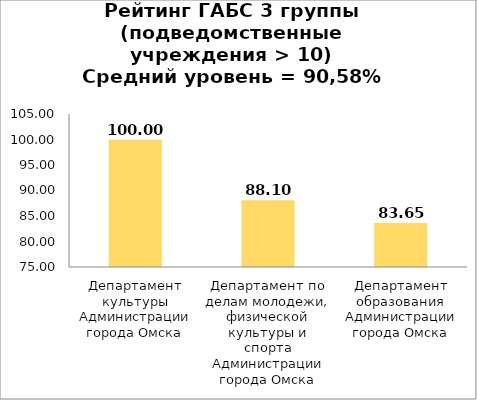
| Category | Series 0 |
|---|---|
| Департамент культуры Администрации города Омска | 100 |
| Департамент по делам молодежи, физической культуры и спорта Администрации города Омска | 88.095 |
| Департамент образования Администрации города Омска | 83.645 |